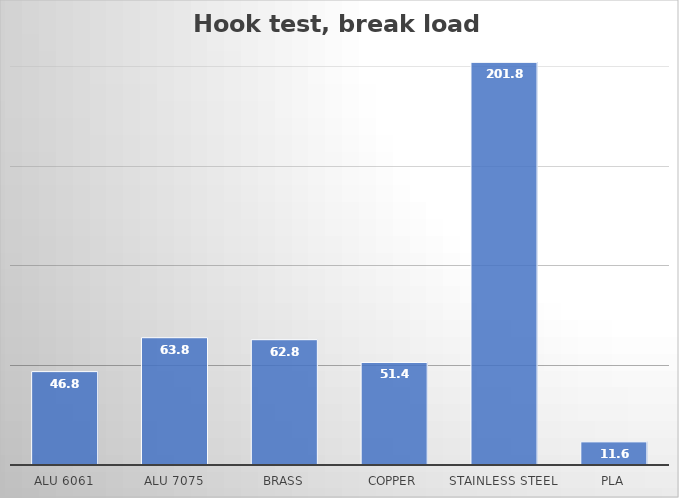
| Category | Series 0 |
|---|---|
| Alu 6061 | 46.8 |
| Alu 7075 | 63.8 |
| Brass | 62.8 |
| Copper | 51.4 |
| Stainless Steel | 201.8 |
| PLA | 11.6 |